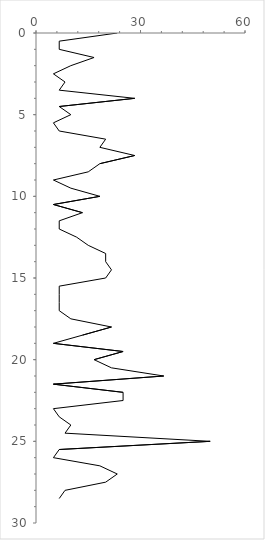
| Category | Series 0 |
|---|---|
| 23.333333333333332 | 0 |
| 6.666666666666667 | 0.5 |
| 6.666666666666667 | 1 |
| 16.666666666666664 | 1.5 |
| 10.000000000000002 | 2 |
| 5.000000000000001 | 2.5 |
| 8.333333333333332 | 3 |
| 6.666666666666667 | 3.5 |
| 28.33333333333334 | 4 |
| 6.666666666666667 | 4.5 |
| 10.0 | 5 |
| 5.000000000000001 | 5.5 |
| 6.666666666666667 | 6 |
| 20.0 | 6.5 |
| 18.333333333333336 | 7 |
| 28.33333333333334 | 7.5 |
| 18.333333333333336 | 8 |
| 15.0 | 8.5 |
| 5.000000000000001 | 9 |
| 10.0 | 9.5 |
| 18.333333333333336 | 10 |
| 5.000000000000001 | 10.5 |
| 13.333333333333334 | 11 |
| 6.666666666666667 | 11.5 |
| 6.666666666666667 | 12 |
| 11.666666666666668 | 12.5 |
| 15.0 | 13 |
| 20.000000000000004 | 13.5 |
| 20.0 | 14 |
| 21.666666666666668 | 14.5 |
| 20.000000000000004 | 15 |
| 6.666666666666667 | 15.5 |
| 6.666666666666667 | 16 |
| 6.666666666666667 | 16.5 |
| 6.666666666666667 | 17 |
| 10.000000000000002 | 17.5 |
| 21.666666666666668 | 18 |
| 13.333333333333334 | 18.5 |
| 5.000000000000001 | 19 |
| 25.0 | 19.5 |
| 16.666666666666664 | 20 |
| 21.666666666666668 | 20.5 |
| 36.66666666666667 | 21 |
| 5.000000000000001 | 21.5 |
| 25.0 | 22 |
| 25.0 | 22.5 |
| 5.000000000000001 | 23 |
| 6.666666666666667 | 23.5 |
| 10.0 | 24 |
| 8.333333333333332 | 24.5 |
| 50.0 | 25 |
| 6.666666666666667 | 25.5 |
| 5.000000000000001 | 26 |
| 18.333333333333336 | 26.5 |
| 23.333333333333332 | 27 |
| 20.000000000000004 | 27.5 |
| 8.333333333333332 | 28 |
| 6.666666666666667 | 28.5 |